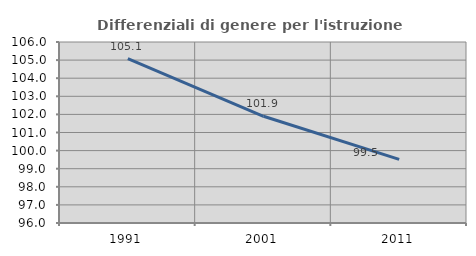
| Category | Differenziali di genere per l'istruzione superiore |
|---|---|
| 1991.0 | 105.083 |
| 2001.0 | 101.895 |
| 2011.0 | 99.511 |